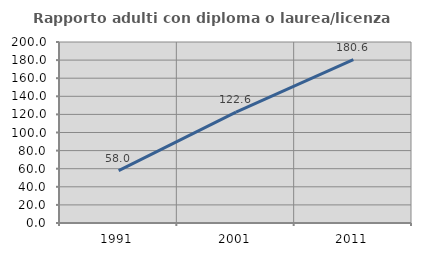
| Category | Rapporto adulti con diploma o laurea/licenza media  |
|---|---|
| 1991.0 | 57.975 |
| 2001.0 | 122.558 |
| 2011.0 | 180.627 |